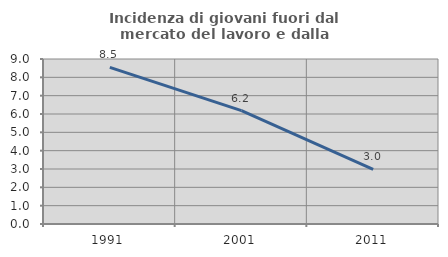
| Category | Incidenza di giovani fuori dal mercato del lavoro e dalla formazione  |
|---|---|
| 1991.0 | 8.547 |
| 2001.0 | 6.186 |
| 2011.0 | 2.985 |